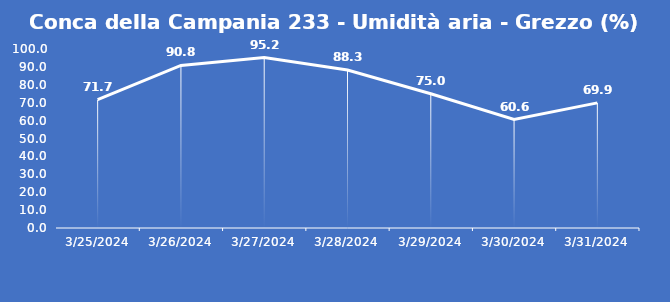
| Category | Conca della Campania 233 - Umidità aria - Grezzo (%) |
|---|---|
| 3/25/24 | 71.7 |
| 3/26/24 | 90.8 |
| 3/27/24 | 95.2 |
| 3/28/24 | 88.3 |
| 3/29/24 | 75 |
| 3/30/24 | 60.6 |
| 3/31/24 | 69.9 |